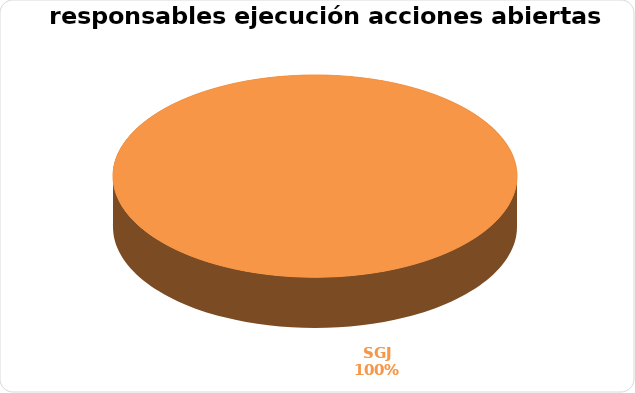
| Category | Series 0 |
|---|---|
| SGJ | 7 |